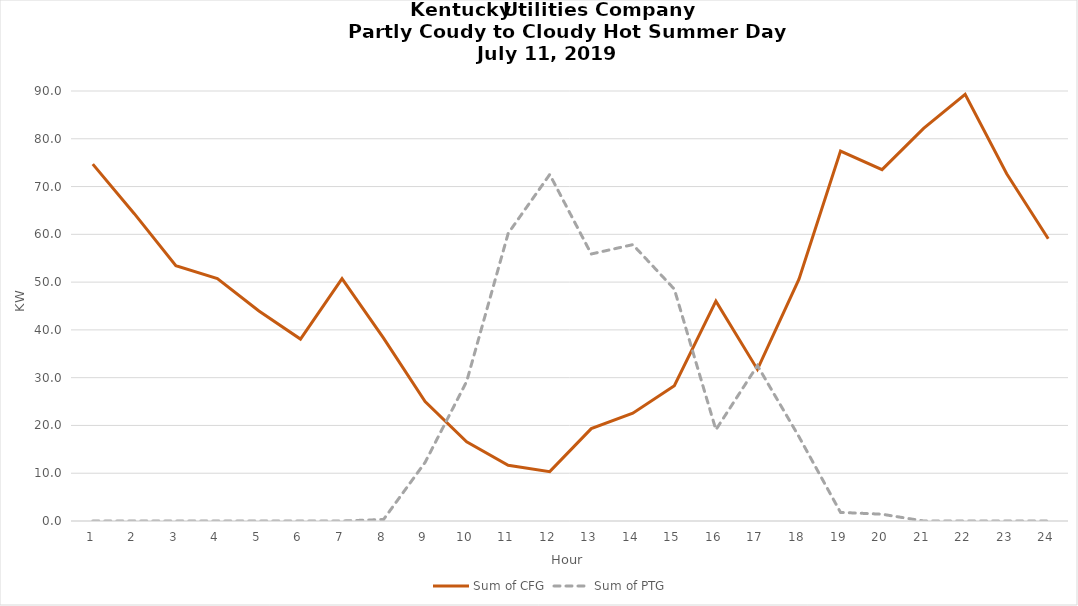
| Category | Sum of CFG | Sum of PTG |
|---|---|---|
| 0 | 74.698 | 0 |
| 1 | 64.326 | 0 |
| 2 | 53.415 | 0 |
| 3 | 50.729 | 0 |
| 4 | 43.95 | 0 |
| 5 | 38.079 | 0 |
| 6 | 50.704 | 0 |
| 7 | 38.286 | 0.318 |
| 8 | 25.005 | 12.279 |
| 9 | 16.568 | 29.198 |
| 10 | 11.666 | 60.206 |
| 11 | 10.337 | 72.524 |
| 12 | 19.33 | 55.886 |
| 13 | 22.56 | 57.842 |
| 14 | 28.301 | 48.52 |
| 15 | 46.015 | 19.094 |
| 16 | 31.723 | 32.532 |
| 17 | 50.627 | 17.64 |
| 18 | 77.439 | 1.801 |
| 19 | 73.534 | 1.421 |
| 20 | 82.161 | 0 |
| 21 | 89.287 | 0 |
| 22 | 72.674 | 0 |
| 23 | 59.082 | 0 |